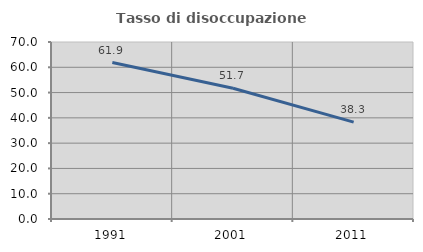
| Category | Tasso di disoccupazione giovanile  |
|---|---|
| 1991.0 | 61.878 |
| 2001.0 | 51.724 |
| 2011.0 | 38.318 |